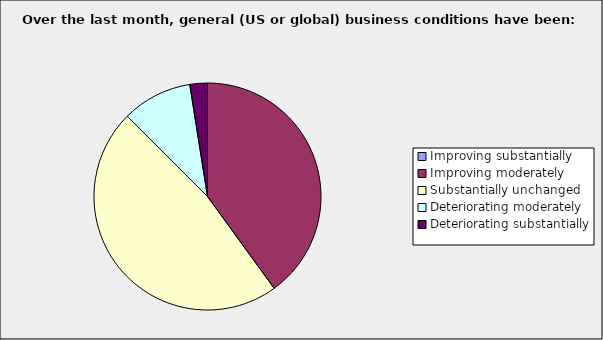
| Category | Series 0 |
|---|---|
| Improving substantially | 0 |
| Improving moderately | 0.4 |
| Substantially unchanged | 0.475 |
| Deteriorating moderately | 0.1 |
| Deteriorating substantially | 0.025 |